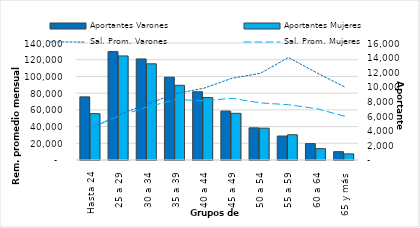
| Category | Aportantes Varones | Aportantes Mujeres |
|---|---|---|
| Hasta 24 | 8633 | 6344 |
| 25 a 29 | 14824 | 14231 |
| 30 a 34 | 13821 | 13153 |
| 35 a 39 | 11323 | 10212 |
| 40 a 44 | 9337 | 8535 |
| 45 a 49 | 6693 | 6383 |
| 50 a 54 | 4399 | 4353 |
| 55 a 59 | 3274 | 3455 |
| 60 a 64 | 2243 | 1552 |
| 65 y más | 1138 | 839 |